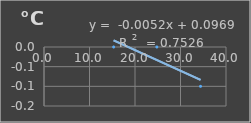
| Category | Temperatura |
|---|---|
| 15.3 | 0 |
| 24.8 | 0 |
| 34.4 | -0.1 |